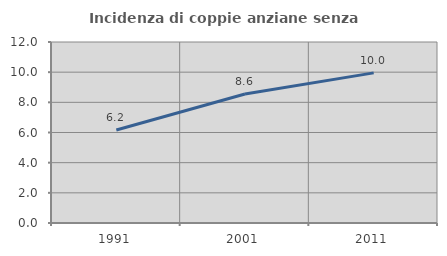
| Category | Incidenza di coppie anziane senza figli  |
|---|---|
| 1991.0 | 6.162 |
| 2001.0 | 8.552 |
| 2011.0 | 9.954 |